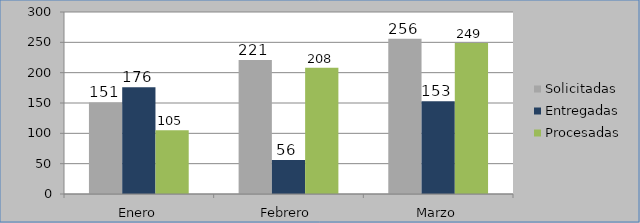
| Category | Solicitadas | Entregadas | Procesadas |
|---|---|---|---|
| Enero | 151 | 176 | 105 |
| Febrero | 221 | 56 | 208 |
| Marzo | 256 | 153 | 249 |